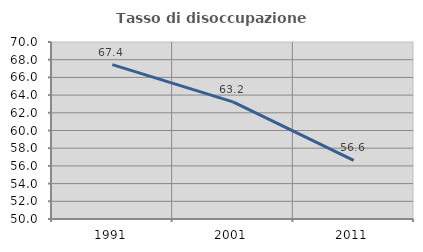
| Category | Tasso di disoccupazione giovanile  |
|---|---|
| 1991.0 | 67.44 |
| 2001.0 | 63.239 |
| 2011.0 | 56.62 |